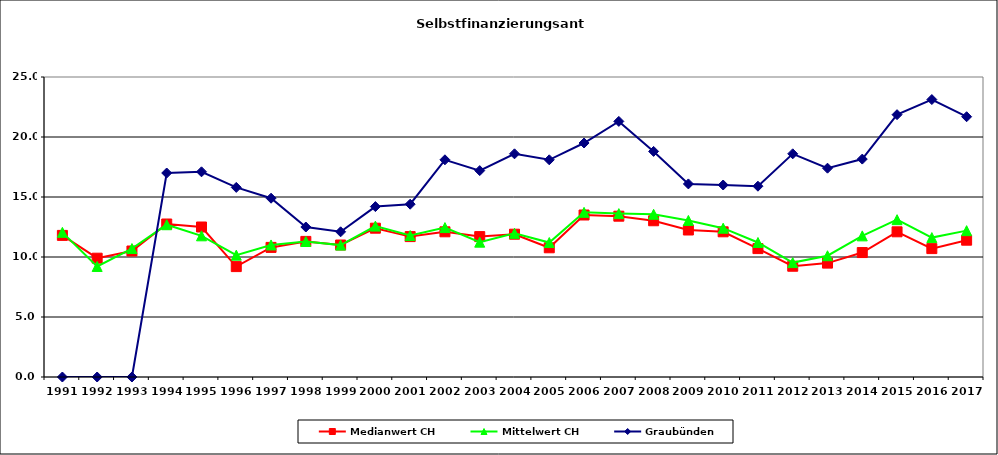
| Category | Medianwert CH | Mittelwert CH | Graubünden |
|---|---|---|---|
| 1991.0 | 11.8 | 12.054 | 0 |
| 1992.0 | 9.9 | 9.211 | 0 |
| 1993.0 | 10.5 | 10.706 | 0 |
| 1994.0 | 12.75 | 12.69 | 17 |
| 1995.0 | 12.5 | 11.765 | 17.1 |
| 1996.0 | 9.2 | 10.152 | 15.8 |
| 1997.0 | 10.8 | 11.005 | 14.9 |
| 1998.0 | 11.3 | 11.291 | 12.5 |
| 1999.0 | 11 | 10.991 | 12.1 |
| 2000.0 | 12.4 | 12.575 | 14.2 |
| 2001.0 | 11.7 | 11.788 | 14.4 |
| 2002.0 | 12.1 | 12.452 | 18.1 |
| 2003.0 | 11.7 | 11.236 | 17.2 |
| 2004.0 | 11.9 | 11.971 | 18.6 |
| 2005.0 | 10.768 | 11.206 | 18.1 |
| 2006.0 | 13.5 | 13.724 | 19.5 |
| 2007.0 | 13.4 | 13.616 | 21.3 |
| 2008.0 | 13.02 | 13.561 | 18.8 |
| 2009.0 | 12.25 | 13.048 | 16.09 |
| 2010.0 | 12.1 | 12.4 | 16 |
| 2011.0 | 10.7 | 11.209 | 15.9 |
| 2012.0 | 9.23 | 9.534 | 18.6 |
| 2013.0 | 9.49 | 10.106 | 17.4 |
| 2014.0 | 10.37 | 11.762 | 18.16 |
| 2015.0 | 12.1 | 13.11 | 21.86 |
| 2016.0 | 10.7 | 11.618 | 23.12 |
| 2017.0 | 11.4 | 12.196 | 21.69 |